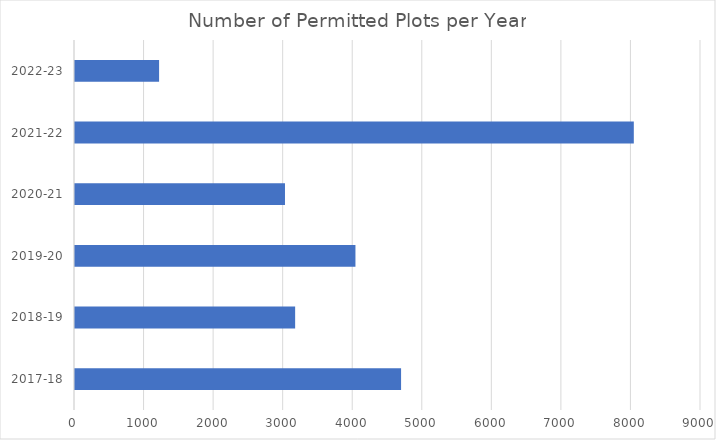
| Category | Number of Permitted Plots per Year |
|---|---|
| 2017-18 | 4688 |
| 2018-19 | 3165 |
| 2019-20 | 4032 |
| 2020-21 | 3019 |
| 2021-22 | 8034 |
| 2022-23 | 1209 |